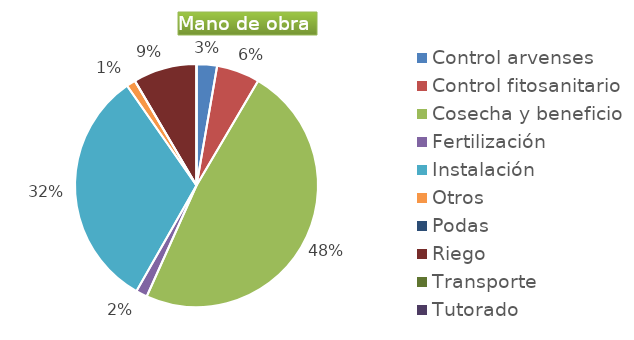
| Category | Series 0 |
|---|---|
| Control arvenses | 524997 |
| Control fitosanitario | 1108327 |
| Cosecha y beneficio | 9300600 |
| Fertilización | 291665 |
| Instalación | 6187161 |
| Otros | 233332 |
| Podas | 0 |
| Riego | 1633324 |
| Transporte | 0 |
| Tutorado | 0 |